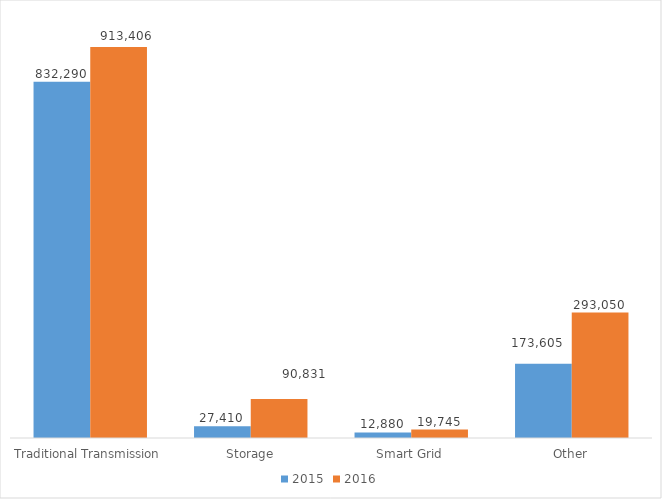
| Category | 2015 | 2016 |
|---|---|---|
| Traditional Transmission | 832290 | 913406 |
| Storage | 27410 | 90831 |
| Smart Grid | 12880 | 19745 |
| Other | 173605 | 293050 |